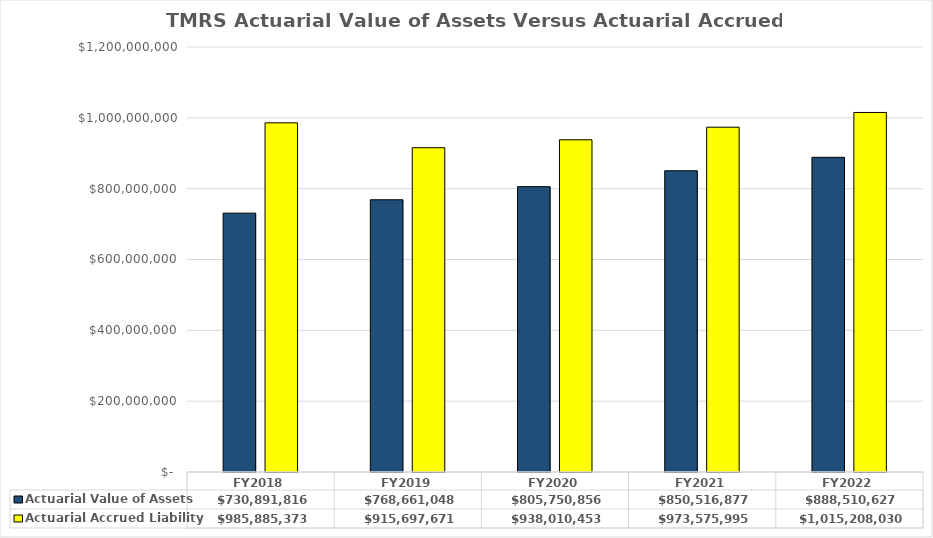
| Category |  Actuarial Value of Assets  |  Actuarial Accrued Liability  |
|---|---|---|
| FY2018 | 730891816 | 985885373 |
| FY2019 | 768661048 | 915697671 |
| FY2020 | 805750856 | 938010453 |
| FY2021 | 850516877 | 973575995 |
| FY2022 | 888510627 | 1015208030 |